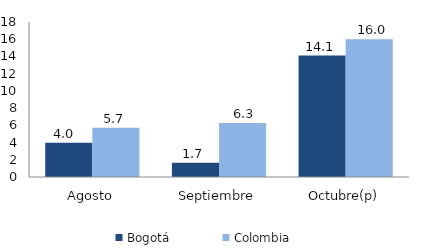
| Category | Bogotá | Colombia |
|---|---|---|
| Agosto | 3.986 | 5.724 |
| Septiembre | 1.666 | 6.261 |
| Octubre(p) | 14.095 | 16.01 |